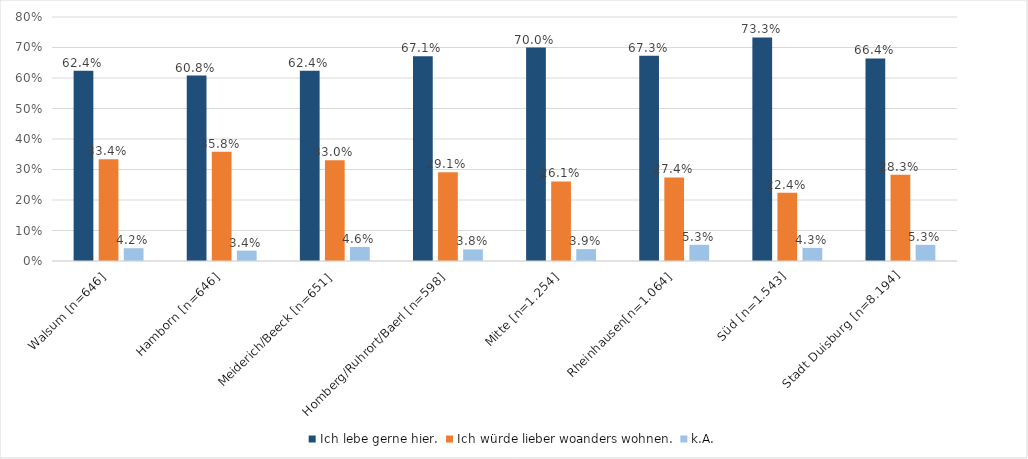
| Category | Ich lebe gerne hier. | Ich würde lieber woanders wohnen. | k.A. |
|---|---|---|---|
| Walsum [n=646] | 0.624 | 0.334 | 0.042 |
| Hamborn [n=646] | 0.608 | 0.358 | 0.034 |
| Meiderich/Beeck [n=651] | 0.624 | 0.33 | 0.046 |
| Homberg/Ruhrort/Baerl [n=598] | 0.671 | 0.291 | 0.038 |
| Mitte [n=1.254] | 0.7 | 0.261 | 0.039 |
| Rheinhausen[n=1.064] | 0.673 | 0.274 | 0.053 |
| Süd [n=1.543] | 0.733 | 0.224 | 0.043 |
| Stadt Duisburg [n=8.194] | 0.664 | 0.283 | 0.053 |